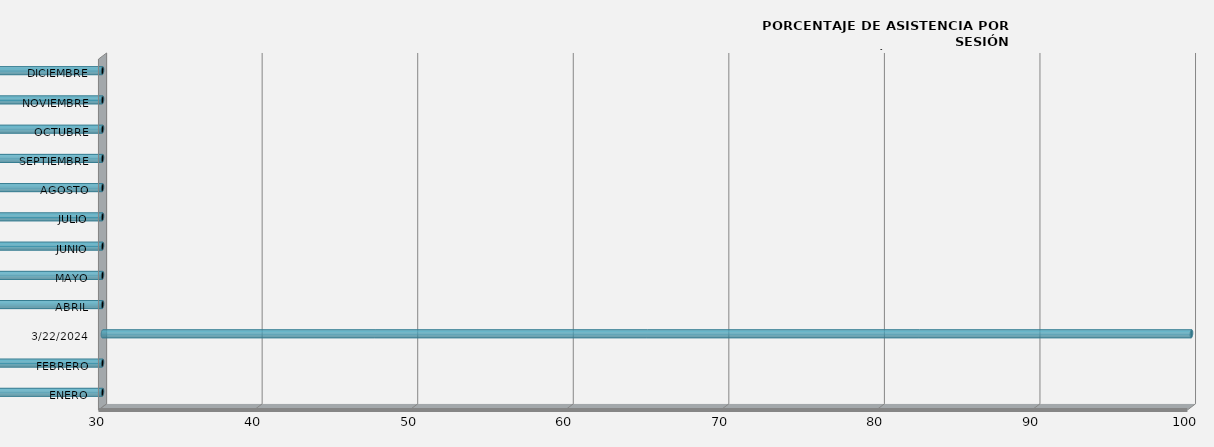
| Category | ENERO |
|---|---|
| ENERO | 0 |
| FEBRERO | 0 |
| 22/03/2024 | 100 |
| ABRIL | 0 |
| MAYO | 0 |
| JUNIO | 0 |
| JULIO | 0 |
| AGOSTO | 0 |
| SEPTIEMBRE | 0 |
| OCTUBRE | 0 |
| NOVIEMBRE | 0 |
| DICIEMBRE | 0 |